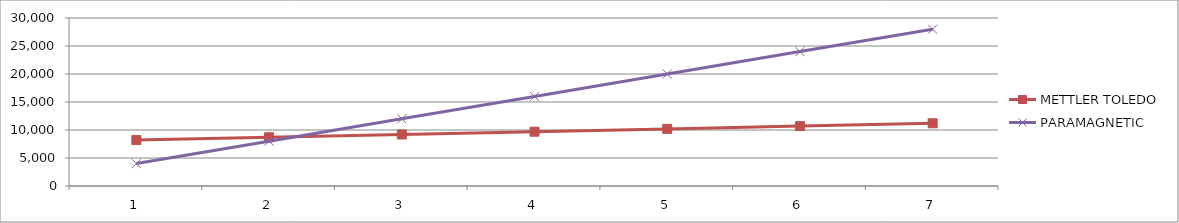
| Category | METTLER TOLEDO | PARAMAGNETIC |
|---|---|---|
| 0 | 8200 | 4000 |
| 1 | 8700 | 8000 |
| 2 | 9200 | 12000 |
| 3 | 9700 | 16000 |
| 4 | 10200 | 20000 |
| 5 | 10700 | 24000 |
| 6 | 11200 | 28000 |